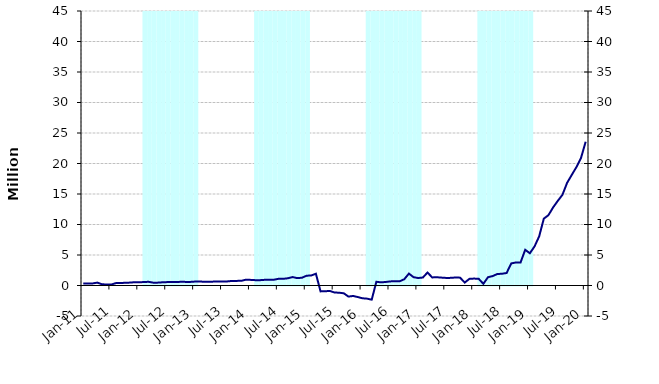
| Category | Series 1 |
|---|---|
| 0 | 0 |
| 1900-01-01 | 0 |
| 1900-01-02 | 0 |
| 1900-01-03 | 0 |
| 1900-01-04 | 0 |
| 1900-01-05 | 0 |
| 1900-01-06 | 0 |
| 1900-01-07 | 0 |
| 1900-01-08 | 0 |
| 1900-01-09 | 0 |
| 1900-01-10 | 0 |
| 1900-01-11 | 0 |
| 1900-01-12 | 0 |
| 1900-01-13 | 45000000 |
| 1900-01-14 | 45000000 |
| 1900-01-15 | 45000000 |
| 1900-01-16 | 45000000 |
| 1900-01-17 | 45000000 |
| 1900-01-18 | 45000000 |
| 1900-01-19 | 45000000 |
| 1900-01-20 | 45000000 |
| 1900-01-21 | 45000000 |
| 1900-01-22 | 45000000 |
| 1900-01-23 | 45000000 |
| 1900-01-24 | 45000000 |
| 1900-01-25 | 0 |
| 1900-01-26 | 0 |
| 1900-01-27 | 0 |
| 1900-01-28 | 0 |
| 1900-01-29 | 0 |
| 1900-01-30 | 0 |
| 1900-01-31 | 0 |
| 1900-02-01 | 0 |
| 1900-02-02 | 0 |
| 1900-02-03 | 0 |
| 1900-02-04 | 0 |
| 1900-02-05 | 0 |
| 1900-02-06 | 45000000 |
| 1900-02-07 | 45000000 |
| 1900-02-08 | 45000000 |
| 1900-02-09 | 45000000 |
| 1900-02-10 | 45000000 |
| 1900-02-11 | 45000000 |
| 1900-02-12 | 45000000 |
| 1900-02-13 | 45000000 |
| 1900-02-14 | 45000000 |
| 1900-02-15 | 45000000 |
| 1900-02-16 | 45000000 |
| 1900-02-17 | 45000000 |
| 1900-02-18 | 0 |
| 1900-02-19 | 0 |
| 1900-02-20 | 0 |
| 1900-02-21 | 0 |
| 1900-02-22 | 0 |
| 1900-02-23 | 0 |
| 1900-02-24 | 0 |
| 1900-02-25 | 0 |
| 1900-02-26 | 0 |
| 1900-02-27 | 0 |
| 1900-02-28 | 0 |
| 1900-02-28 | 0 |
| 1900-03-01 | 45000000 |
| 1900-03-02 | 45000000 |
| 1900-03-03 | 45000000 |
| 1900-03-04 | 45000000 |
| 1900-03-05 | 45000000 |
| 1900-03-06 | 45000000 |
| 1900-03-07 | 45000000 |
| 1900-03-08 | 45000000 |
| 1900-03-09 | 45000000 |
| 1900-03-10 | 45000000 |
| 1900-03-11 | 45000000 |
| 1900-03-12 | 45000000 |
| 1900-03-13 | 0 |
| 1900-03-14 | 0 |
| 1900-03-15 | 0 |
| 1900-03-16 | 0 |
| 1900-03-17 | 0 |
| 1900-03-18 | 0 |
| 1900-03-19 | 0 |
| 1900-03-20 | 0 |
| 1900-03-21 | 0 |
| 1900-03-22 | 0 |
| 1900-03-23 | 0 |
| 1900-03-24 | 0 |
| 1900-03-25 | 45000000 |
| 1900-03-26 | 45000000 |
| 1900-03-27 | 45000000 |
| 1900-03-28 | 45000000 |
| 1900-03-29 | 45000000 |
| 1900-03-30 | 45000000 |
| 1900-03-31 | 45000000 |
| 1900-04-01 | 45000000 |
| 1900-04-02 | 45000000 |
| 1900-04-03 | 45000000 |
| 1900-04-04 | 45000000 |
| 1900-04-05 | 45000000 |
| 1900-04-06 | 0 |
| 1900-04-07 | 0 |
| 1900-04-08 | 0 |
| 1900-04-09 | 0 |
| 1900-04-10 | 0 |
| 1900-04-11 | 0 |
| 1900-04-12 | 0 |
| 1900-04-13 | 0 |
| 1900-04-14 | 0 |
| 1900-04-15 | 0 |
| 1900-04-16 | 0 |
| 1900-04-17 | 0 |